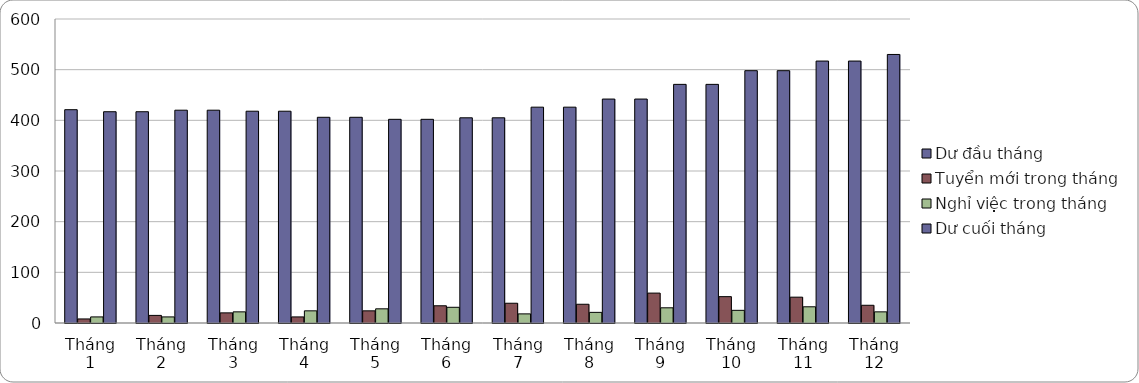
| Category | Dư đầu tháng | Tuyển mới trong tháng | Nghỉ việc trong tháng | Dư cuối tháng |
|---|---|---|---|---|
| Tháng 1 | 421 | 8 | 12 | 417 |
| Tháng 2 | 417 | 15 | 12 | 420 |
| Tháng 3 | 420 | 20 | 22 | 418 |
| Tháng 4 | 418 | 12 | 24 | 406 |
| Tháng 5 | 406 | 24 | 28 | 402 |
| Tháng 6 | 402 | 34 | 31 | 405 |
| Tháng 7 | 405 | 39 | 18 | 426 |
| Tháng 8 | 426 | 37 | 21 | 442 |
| Tháng 9 | 442 | 59 | 30 | 471 |
| Tháng 10 | 471 | 52 | 25 | 498 |
| Tháng 11 | 498 | 51 | 32 | 517 |
| Tháng 12 | 517 | 35 | 22 | 530 |